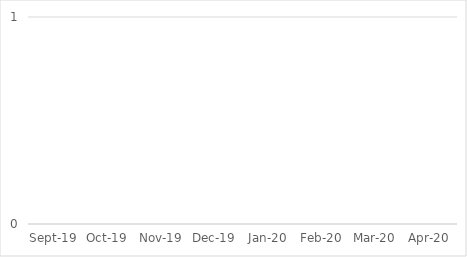
| Category | Total activity |
|---|---|
| 2019-09-01 | 0 |
| 2019-10-01 | 0 |
| 2019-11-01 | 0 |
| 2019-12-01 | 0 |
| 2020-01-01 | 0 |
| 2020-02-01 | 0 |
| 2020-03-01 | 0 |
| 2020-04-01 | 0 |